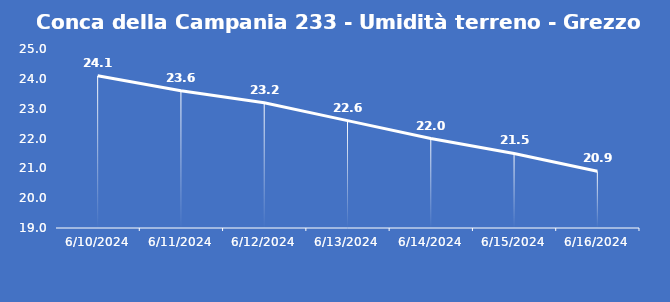
| Category | Conca della Campania 233 - Umidità terreno - Grezzo (%VWC) |
|---|---|
| 6/10/24 | 24.1 |
| 6/11/24 | 23.6 |
| 6/12/24 | 23.2 |
| 6/13/24 | 22.6 |
| 6/14/24 | 22 |
| 6/15/24 | 21.5 |
| 6/16/24 | 20.9 |